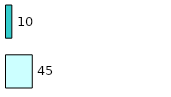
| Category | Series 0 | Series 1 |
|---|---|---|
| 0 | 45 | 10 |